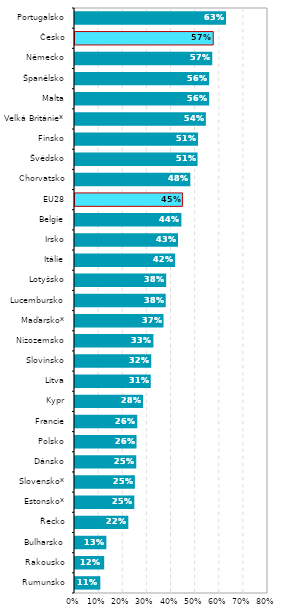
| Category | Series 0 |
|---|---|
| Rumunsko | 0.105 |
| Rakousko | 0.121 |
| Bulharsko | 0.13 |
| Řecko | 0.221 |
| Estonsko* | 0.246 |
| Slovensko* | 0.248 |
| Dánsko | 0.254 |
| Polsko | 0.255 |
| Francie | 0.258 |
| Kypr | 0.282 |
| Litva | 0.314 |
| Slovinsko | 0.316 |
| Nizozemsko | 0.325 |
| Maďarsko* | 0.367 |
| Lucembursko | 0.376 |
| Lotyšsko | 0.378 |
| Itálie | 0.415 |
| Irsko | 0.427 |
| Belgie | 0.441 |
| EU28 | 0.446 |
| Chorvatsko | 0.478 |
| Švédsko | 0.508 |
| Finsko | 0.51 |
| Velká Británie* | 0.542 |
| Malta | 0.556 |
| Španělsko | 0.556 |
| Německo | 0.569 |
| Česko | 0.573 |
| Portugalsko | 0.626 |